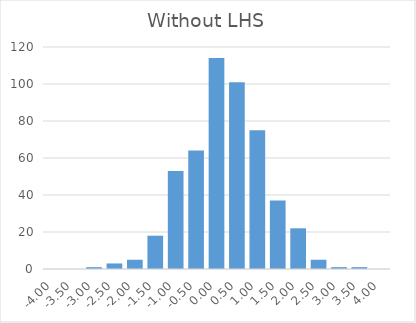
| Category | Series 0 |
|---|---|
| -4.0 | 0 |
| -3.5 | 0 |
| -3.0 | 1 |
| -2.5 | 3 |
| -2.0 | 5 |
| -1.5 | 18 |
| -1.0 | 53 |
| -0.5 | 64 |
| 0.0 | 114 |
| 0.5 | 101 |
| 1.0 | 75 |
| 1.5 | 37 |
| 2.0 | 22 |
| 2.5 | 5 |
| 3.0 | 1 |
| 3.5 | 1 |
| 4.0 | 0 |